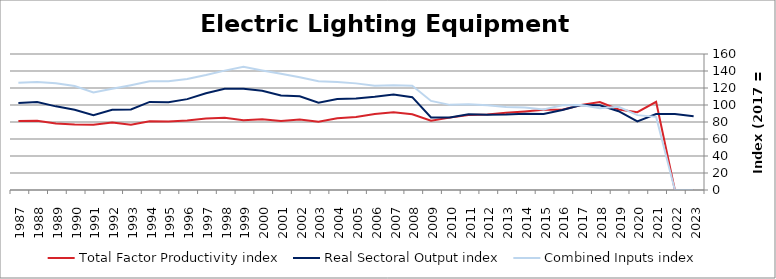
| Category | Total Factor Productivity index | Real Sectoral Output index | Combined Inputs index |
|---|---|---|---|
| 2023.0 | 0 | 86.723 | 0 |
| 2022.0 | 0 | 89.49 | 0 |
| 2021.0 | 103.732 | 89.297 | 86.084 |
| 2020.0 | 91.506 | 80.598 | 88.08 |
| 2019.0 | 94.753 | 92.74 | 97.875 |
| 2018.0 | 103.458 | 99.571 | 96.242 |
| 2017.0 | 100 | 100 | 100 |
| 2016.0 | 94.529 | 94.179 | 99.63 |
| 2015.0 | 94.502 | 89.473 | 94.678 |
| 2014.0 | 92.445 | 89.842 | 97.185 |
| 2013.0 | 90.749 | 88.72 | 97.765 |
| 2012.0 | 88.878 | 88.568 | 99.652 |
| 2011.0 | 88.304 | 89.147 | 100.955 |
| 2010.0 | 85.141 | 85.282 | 100.166 |
| 2009.0 | 81.457 | 85.349 | 104.778 |
| 2008.0 | 89.1 | 109.21 | 122.571 |
| 2007.0 | 91.332 | 112.435 | 123.106 |
| 2006.0 | 89.421 | 109.798 | 122.787 |
| 2005.0 | 85.894 | 107.749 | 125.443 |
| 2004.0 | 84.3 | 106.997 | 126.925 |
| 2003.0 | 80.212 | 102.679 | 128.009 |
| 2002.0 | 83.008 | 110.156 | 132.705 |
| 2001.0 | 81.257 | 111.155 | 136.794 |
| 2000.0 | 83.089 | 116.869 | 140.656 |
| 1999.0 | 82.131 | 119.107 | 145.021 |
| 1998.0 | 84.884 | 119.215 | 140.445 |
| 1997.0 | 84.196 | 113.859 | 135.23 |
| 1996.0 | 81.898 | 106.904 | 130.533 |
| 1995.0 | 80.638 | 103.14 | 127.906 |
| 1994.0 | 80.964 | 103.598 | 127.956 |
| 1993.0 | 76.838 | 94.707 | 123.255 |
| 1992.0 | 79.266 | 94.344 | 119.023 |
| 1991.0 | 76.848 | 88.123 | 114.671 |
| 1990.0 | 77.201 | 94.48 | 122.381 |
| 1989.0 | 78.28 | 98.406 | 125.71 |
| 1988.0 | 81.447 | 103.405 | 126.96 |
| 1987.0 | 81.255 | 102.45 | 126.084 |